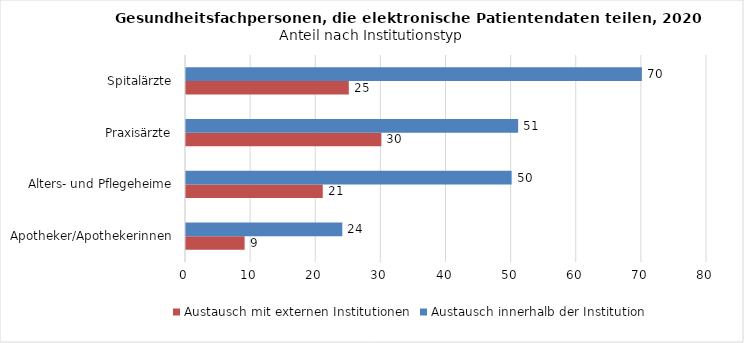
| Category | Austausch mit externen Institutionen | Austausch innerhalb der Institution |
|---|---|---|
| Apotheker/Apothekerinnen | 9 | 24 |
| Alters- und Pflegeheime | 21 | 50 |
| Praxisärzte | 30 | 51 |
| Spitalärzte | 25 | 70 |